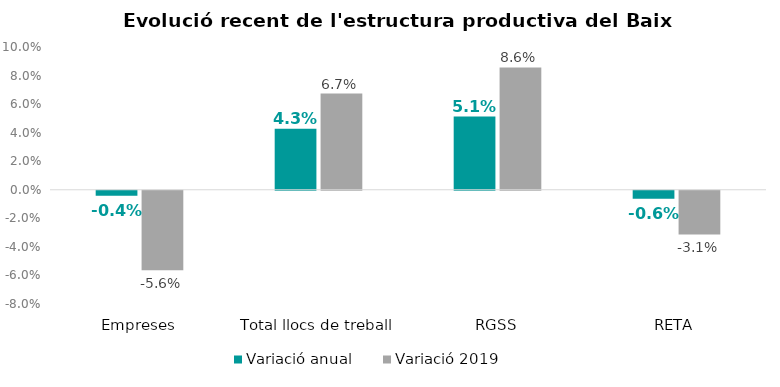
| Category | Variació anual | Variació 2019 |
|---|---|---|
| Empreses | -0.004 | -0.056 |
| Total llocs de treball | 0.043 | 0.067 |
| RGSS | 0.051 | 0.086 |
| RETA | -0.006 | -0.031 |